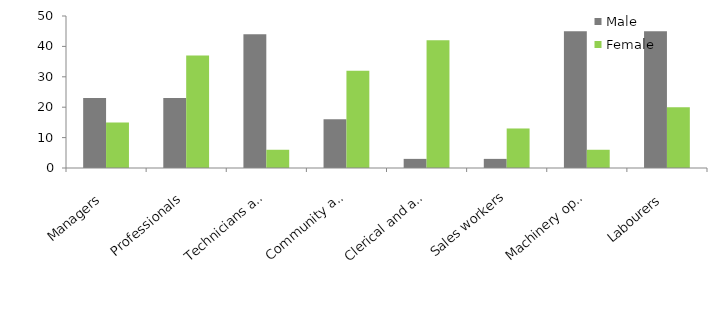
| Category | Male | Female |
|---|---|---|
| Managers | 23 | 15 |
| Professionals | 23 | 37 |
| Technicians and trades workers | 44 | 6 |
| Community and personal service workers | 16 | 32 |
| Clerical and administrative workers | 3 | 42 |
| Sales workers | 3 | 13 |
| Machinery operators and drivers | 45 | 6 |
| Labourers | 45 | 20 |